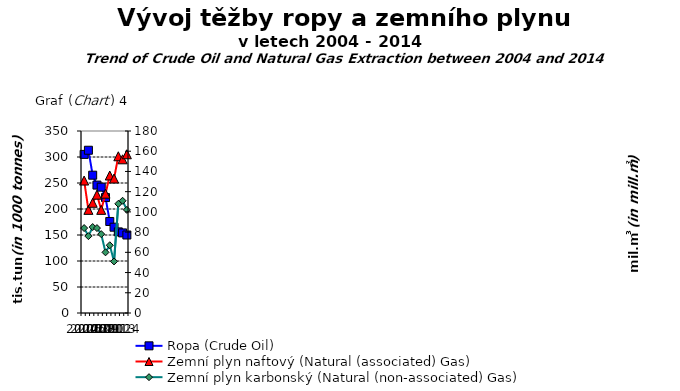
| Category | Ropa (Crude Oil) |
|---|---|
| 2004.0 | 305 |
| 2005.0 | 313 |
| 2006.0 | 265 |
| 2007.0 | 246 |
| 2008.0 | 242 |
| 2009.0 | 222 |
| 2010.0 | 176 |
| 2011.0 | 165 |
| 2012.0 | 156 |
| 2013.0 | 154 |
| 2014.0 | 150 |